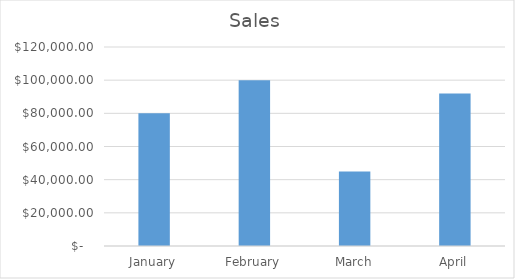
| Category | Sales |
|---|---|
| January | 80000 |
| February | 100000 |
| March | 45000 |
| April | 92000 |